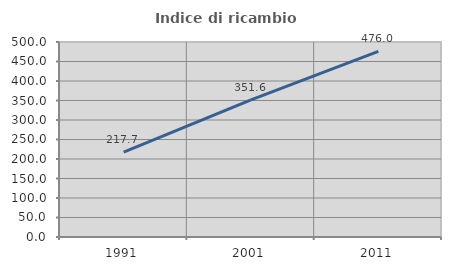
| Category | Indice di ricambio occupazionale  |
|---|---|
| 1991.0 | 217.742 |
| 2001.0 | 351.613 |
| 2011.0 | 476 |